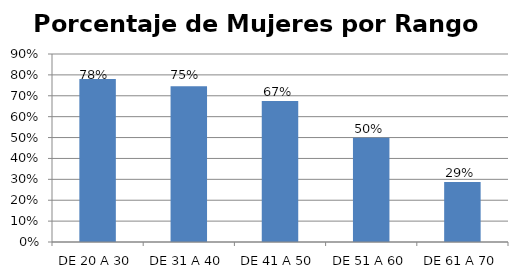
| Category | Porcentaje |
|---|---|
| DE 20 A 30 | 0.78 |
| DE 31 A 40 | 0.746 |
| DE 41 A 50 | 0.675 |
| DE 51 A 60 | 0.499 |
| DE 61 A 70 | 0.287 |